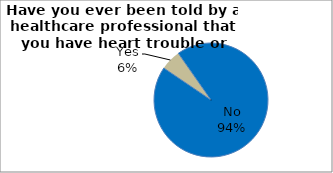
| Category | Series 0 |
|---|---|
| No | 94.194 |
| Yes | 5.806 |